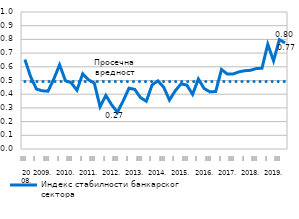
| Category | Индекс стабилности банкарског сектора | Просечна вредност |
|---|---|---|
| 0 | 0.653 | 0.492 |
| 1 | 0.527 | 0.492 |
| 2 | 0.438 | 0.492 |
| 3 | 0.425 | 0.492 |
| 4 | 0.422 | 0.492 |
| 5 | 0.511 | 0.492 |
| 6 | 0.615 | 0.492 |
| 7 | 0.499 | 0.492 |
| 8 | 0.484 | 0.492 |
| 9 | 0.429 | 0.492 |
| 10 | 0.549 | 0.492 |
| 11 | 0.505 | 0.492 |
| 12 | 0.482 | 0.492 |
| 13 | 0.309 | 0.492 |
| 14 | 0.391 | 0.492 |
| 15 | 0.323 | 0.492 |
| 16 | 0.268 | 0.492 |
| 17 | 0.351 | 0.492 |
| 18 | 0.444 | 0.492 |
| 19 | 0.435 | 0.492 |
| 20 | 0.375 | 0.492 |
| 21 | 0.349 | 0.492 |
| 22 | 0.468 | 0.492 |
| 23 | 0.497 | 0.492 |
| 24 | 0.452 | 0.492 |
| 25 | 0.357 | 0.492 |
| 26 | 0.425 | 0.492 |
| 27 | 0.476 | 0.492 |
| 28 | 0.467 | 0.492 |
| 29 | 0.399 | 0.492 |
| 30 | 0.511 | 0.492 |
| 31 | 0.442 | 0.492 |
| 32 | 0.417 | 0.492 |
| 33 | 0.42 | 0.492 |
| 34 | 0.581 | 0.492 |
| 35 | 0.547 | 0.492 |
| 36 | 0.548 | 0.492 |
| 37 | 0.563 | 0.492 |
| 38 | 0.571 | 0.492 |
| 39 | 0.574 | 0.492 |
| 40 | 0.587 | 0.492 |
| 41 | 0.589 | 0.492 |
| 42 | 0.765 | 0.492 |
| 43 | 0.643 | 0.492 |
| 44 | 0.798 | 0.492 |
| 45 | 0.774 | 0.492 |